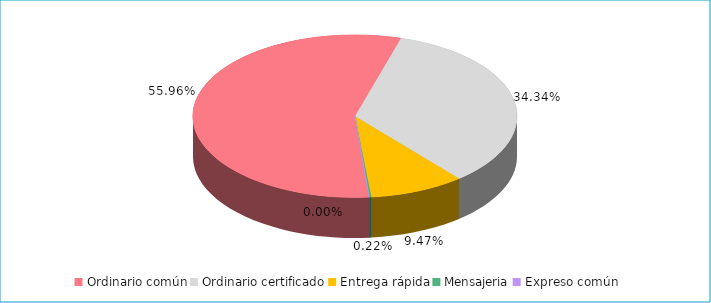
| Category | Series 0 |
|---|---|
| Ordinario común | 0.56 |
| Ordinario certificado | 0.343 |
| Entrega rápida | 0.095 |
| Mensajeria | 0.002 |
| Expreso común | 0 |